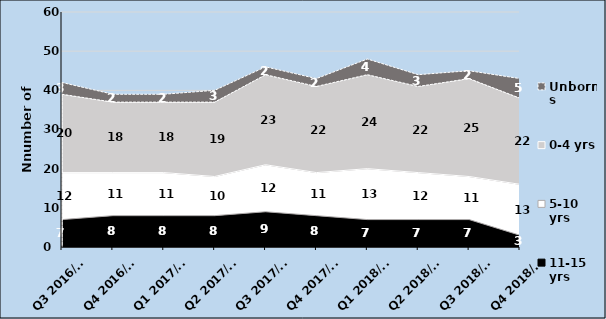
| Category | 11-15 yrs | 5-10 yrs | 0-4 yrs | Unborns |
|---|---|---|---|---|
| Q3 2016/17 | 7 | 12 | 20 | 3 |
| Q4 2016/17 | 8 | 11 | 18 | 2 |
| Q1 2017/18 | 8 | 11 | 18 | 2 |
| Q2 2017/18 | 8 | 10 | 19 | 3 |
| Q3 2017/18 | 9 | 12 | 23 | 2 |
| Q4 2017/18 | 8 | 11 | 22 | 2 |
| Q1 2018/19 | 7 | 13 | 24 | 4 |
| Q2 2018/19 | 7 | 12 | 22 | 3 |
| Q3 2018/19 | 7 | 11 | 25 | 2 |
| Q4 2018/19 | 3 | 13 | 22 | 5 |